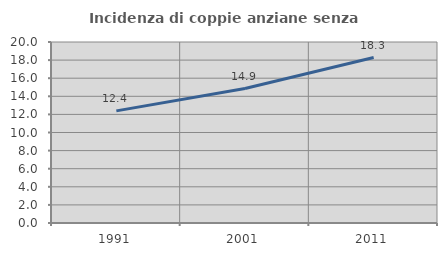
| Category | Incidenza di coppie anziane senza figli  |
|---|---|
| 1991.0 | 12.389 |
| 2001.0 | 14.857 |
| 2011.0 | 18.286 |